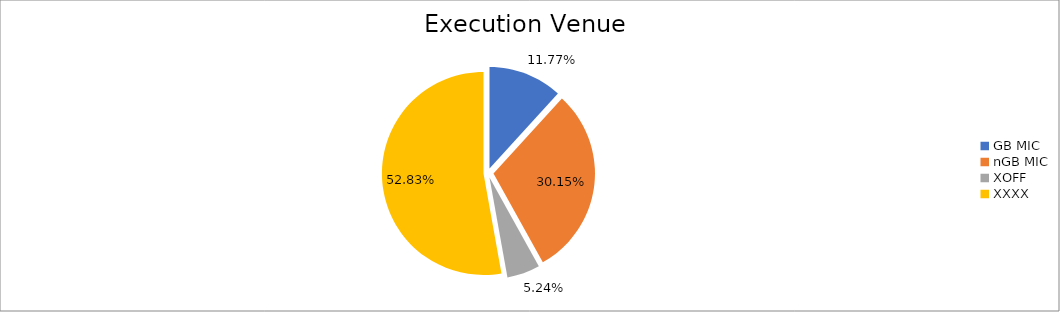
| Category | Series 0 |
|---|---|
| GB MIC | 1138941.931 |
| nGB MIC | 2917703.296 |
| XOFF | 507496.151 |
| XXXX | 5112398.578 |